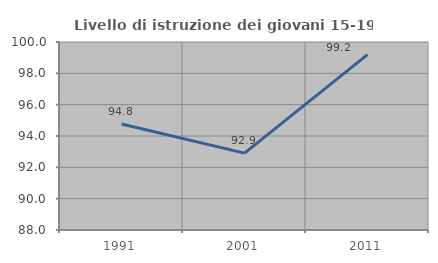
| Category | Livello di istruzione dei giovani 15-19 anni |
|---|---|
| 1991.0 | 94.767 |
| 2001.0 | 92.908 |
| 2011.0 | 99.194 |